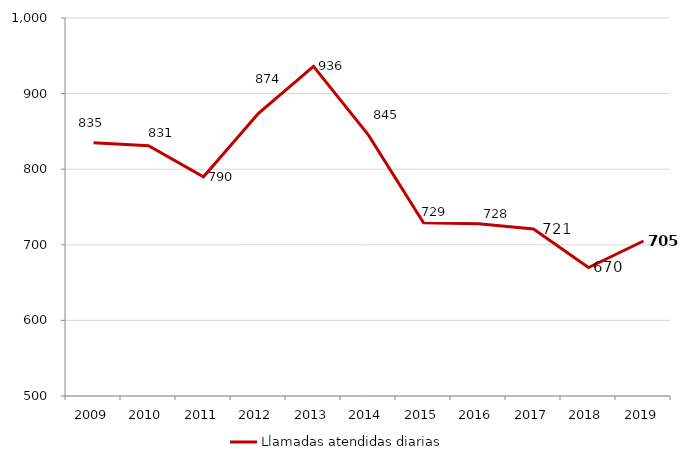
| Category | Llamadas atendidas diarias |
|---|---|
| 2009.0 | 835 |
| 2010.0 | 831 |
| 2011.0 | 790 |
| 2012.0 | 874 |
| 2013.0 | 936 |
| 2014.0 | 845 |
| 2015.0 | 729 |
| 2016.0 | 728 |
| 2017.0 | 721 |
| 2018.0 | 670 |
| 2019.0 | 705 |